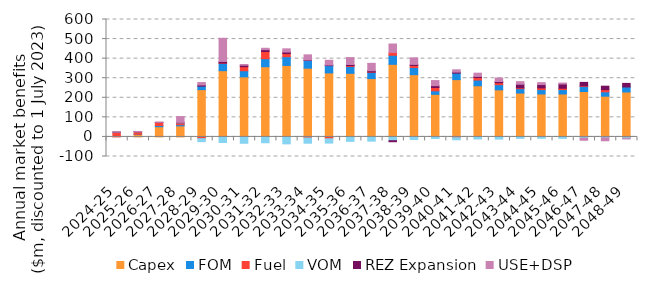
| Category | Capex | FOM | Fuel | VOM | REZ Expansion | USE+DSP |
|---|---|---|---|---|---|---|
| 2024-25 | 0 | 0 | 23.369 | 0.944 | 0.434 | 0.061 |
| 2025-26 | 12.456 | 1.276 | 12.084 | 0.477 | 1.127 | 0.07 |
| 2026-27 | 52.195 | 6.051 | 15.444 | 0.072 | 0.7 | 0.873 |
| 2027-28 | 56.261 | 6.487 | 8.66 | 0.542 | 2.283 | 29.741 |
| 2028-29 | 241.608 | 17.996 | -8.844 | -15.417 | 5.86 | 12.468 |
| 2029-30 | 338.514 | 37.293 | 1.725 | -28.444 | 8.08 | 118.438 |
| 2030-31 | 306.935 | 31.357 | 20.387 | -32.435 | 7.605 | 3.824 |
| 2031-32 | 358.719 | 41.04 | 36.678 | -29.812 | 9.372 | 7.086 |
| 2032-33 | 365.184 | 44.664 | 15.899 | -35.371 | 8.022 | 16.315 |
| 2033-34 | 351.279 | 39.518 | -5.312 | -26.808 | 2.373 | 26.21 |
| 2034-35 | 327.1 | 37.189 | -9.482 | -22.007 | 2.956 | 24.324 |
| 2035-36 | 325.045 | 34.454 | 4.581 | -22.644 | 5.936 | 35.403 |
| 2036-37 | 298.037 | 32.023 | 1.701 | -21.446 | 6.483 | 37.682 |
| 2037-38 | 370.988 | 46.208 | 14.647 | -19.375 | -5.106 | 42.951 |
| 2038-39 | 318.114 | 36.449 | 10.727 | -13.074 | 5.266 | 33.563 |
| 2039-40 | 217.556 | 17.963 | 16.866 | -8.023 | 9.596 | 25.931 |
| 2040-41 | 292.773 | 33.151 | -3.997 | -10.669 | 5.382 | 11.685 |
| 2041-42 | 261.431 | 29.089 | 12.789 | -10.588 | 5.747 | 16.702 |
| 2042-43 | 240.631 | 26.256 | 9.938 | -11.045 | 6.426 | 17.875 |
| 2043-44 | 224.234 | 22.389 | 4.281 | -7.36 | 18.278 | 13.091 |
| 2044-45 | 219.459 | 22.469 | 8.421 | -7.073 | 17.25 | 9.773 |
| 2045-46 | 219.443 | 22.601 | 6.666 | -7.355 | 21.644 | 4.923 |
| 2046-47 | 232.252 | 25.665 | 3.21 | -6.163 | 17.571 | -10.881 |
| 2047-48 | 208.083 | 22.543 | 10.534 | -4.791 | 18.059 | -14.685 |
| 2048-49 | 229.647 | 25.602 | -3.616 | -5.221 | 18.283 | -1.072 |